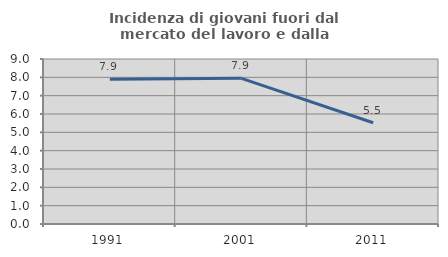
| Category | Incidenza di giovani fuori dal mercato del lavoro e dalla formazione  |
|---|---|
| 1991.0 | 7.898 |
| 2001.0 | 7.945 |
| 2011.0 | 5.523 |